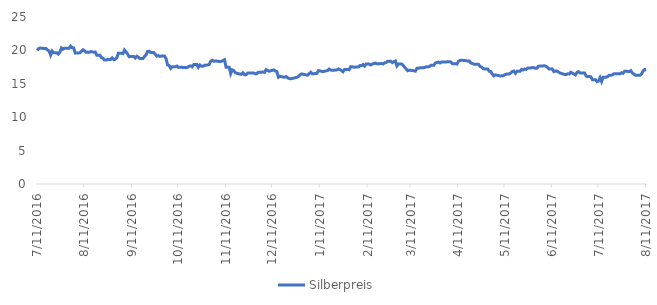
| Category | Silberpreis |
|---|---|
| 7/11/16 | 20.29 |
| 7/12/16 | 20.16 |
| 7/13/16 | 20.36 |
| 7/14/16 | 20.33 |
| 7/15/16 | 20.3 |
| 7/17/16 | 20.3 |
| 7/18/16 | 20.05 |
| 7/19/16 | 19.91 |
| 7/20/16 | 19.3 |
| 7/21/16 | 19.9 |
| 7/22/16 | 19.64 |
| 7/24/16 | 19.64 |
| 7/25/16 | 19.45 |
| 7/26/16 | 19.76 |
| 7/27/16 | 20.36 |
| 7/28/16 | 20.17 |
| 7/29/16 | 20.34 |
| 7/31/16 | 20.34 |
| 8/1/16 | 20.32 |
| 8/2/16 | 20.63 |
| 8/3/16 | 20.41 |
| 8/4/16 | 20.36 |
| 8/5/16 | 19.62 |
| 8/7/16 | 19.62 |
| 8/8/16 | 19.64 |
| 8/9/16 | 19.87 |
| 8/10/16 | 20.1 |
| 8/11/16 | 19.96 |
| 8/12/16 | 19.72 |
| 8/14/16 | 19.72 |
| 8/15/16 | 19.82 |
| 8/16/16 | 19.8 |
| 8/17/16 | 19.71 |
| 8/18/16 | 19.76 |
| 8/19/16 | 19.27 |
| 8/21/16 | 19.27 |
| 8/22/16 | 18.92 |
| 8/23/16 | 18.83 |
| 8/24/16 | 18.55 |
| 8/25/16 | 18.55 |
| 8/26/16 | 18.65 |
| 8/28/16 | 18.65 |
| 8/29/16 | 18.88 |
| 8/30/16 | 18.62 |
| 8/31/16 | 18.66 |
| 9/1/16 | 18.89 |
| 9/2/16 | 19.58 |
| 9/4/16 | 19.58 |
| 9/5/16 | 19.52 |
| 9/6/16 | 20.06 |
| 9/7/16 | 19.79 |
| 9/8/16 | 19.45 |
| 9/9/16 | 19.06 |
| 9/12/16 | 19.1 |
| 9/13/16 | 18.86 |
| 9/14/16 | 19.12 |
| 9/15/16 | 18.98 |
| 9/16/16 | 18.78 |
| 9/18/16 | 18.78 |
| 9/19/16 | 19.09 |
| 9/20/16 | 19.3 |
| 9/21/16 | 19.85 |
| 9/22/16 | 19.88 |
| 9/23/16 | 19.67 |
| 9/25/16 | 19.67 |
| 9/26/16 | 19.43 |
| 9/27/16 | 19.14 |
| 9/28/16 | 19.22 |
| 9/29/16 | 19.1 |
| 9/30/16 | 19.16 |
| 10/2/16 | 19.16 |
| 10/3/16 | 18.75 |
| 10/4/16 | 17.83 |
| 10/5/16 | 17.74 |
| 10/6/16 | 17.32 |
| 10/7/16 | 17.55 |
| 10/9/16 | 17.55 |
| 10/10/16 | 17.66 |
| 10/11/16 | 17.46 |
| 10/12/16 | 17.49 |
| 10/13/16 | 17.5 |
| 10/14/16 | 17.43 |
| 10/16/16 | 17.43 |
| 10/17/16 | 17.47 |
| 10/18/16 | 17.63 |
| 10/19/16 | 17.68 |
| 10/20/16 | 17.55 |
| 10/21/16 | 17.88 |
| 10/23/16 | 17.88 |
| 10/24/16 | 17.47 |
| 10/25/16 | 17.82 |
| 10/26/16 | 17.62 |
| 10/27/16 | 17.63 |
| 10/28/16 | 17.77 |
| 10/30/16 | 17.82 |
| 10/31/16 | 17.88 |
| 11/1/16 | 18.37 |
| 11/2/16 | 18.53 |
| 11/3/16 | 18.37 |
| 11/4/16 | 18.43 |
| 11/7/16 | 18.32 |
| 11/8/16 | 18.37 |
| 11/9/16 | 18.48 |
| 11/10/16 | 18.6 |
| 11/11/16 | 17.47 |
| 11/13/16 | 17.47 |
| 11/14/16 | 16.53 |
| 11/15/16 | 17.09 |
| 11/16/16 | 16.98 |
| 11/17/16 | 16.66 |
| 11/18/16 | 16.57 |
| 11/21/16 | 16.42 |
| 11/22/16 | 16.65 |
| 11/23/16 | 16.35 |
| 11/24/16 | 16.34 |
| 11/25/16 | 16.61 |
| 11/27/16 | 16.61 |
| 11/28/16 | 16.61 |
| 11/29/16 | 16.63 |
| 11/30/16 | 16.51 |
| 12/1/16 | 16.52 |
| 12/2/16 | 16.74 |
| 12/5/16 | 16.75 |
| 12/6/16 | 16.71 |
| 12/7/16 | 17.13 |
| 12/8/16 | 17.01 |
| 12/9/16 | 16.88 |
| 12/12/16 | 17.08 |
| 12/13/16 | 16.91 |
| 12/14/16 | 16.84 |
| 12/15/16 | 15.98 |
| 12/16/16 | 16.12 |
| 12/19/16 | 15.97 |
| 12/20/16 | 16.09 |
| 12/21/16 | 15.89 |
| 12/22/16 | 15.8 |
| 12/23/16 | 15.74 |
| 12/27/16 | 15.97 |
| 12/28/16 | 16.08 |
| 12/29/16 | 16.33 |
| 12/30/16 | 16.48 |
| 1/3/17 | 16.29 |
| 1/4/17 | 16.54 |
| 1/5/17 | 16.73 |
| 1/6/17 | 16.49 |
| 1/9/17 | 16.56 |
| 1/10/17 | 16.98 |
| 1/13/17 | 16.82 |
| 1/16/17 | 16.99 |
| 1/17/17 | 17.2 |
| 1/18/17 | 17.06 |
| 1/19/17 | 17.01 |
| 1/22/17 | 17.08 |
| 1/23/17 | 17.23 |
| 1/24/17 | 17.11 |
| 1/25/17 | 16.99 |
| 1/26/17 | 16.8 |
| 1/27/17 | 17.14 |
| 1/29/17 | 17.14 |
| 1/30/17 | 17.12 |
| 1/31/17 | 17.57 |
| 2/1/17 | 17.56 |
| 2/2/17 | 17.48 |
| 2/3/17 | 17.51 |
| 2/5/17 | 17.51 |
| 2/6/17 | 17.74 |
| 2/7/17 | 17.71 |
| 2/8/17 | 17.89 |
| 2/9/17 | 17.65 |
| 2/10/17 | 17.96 |
| 2/12/17 | 17.96 |
| 2/13/17 | 17.82 |
| 2/14/17 | 17.96 |
| 2/16/17 | 18.1 |
| 2/17/17 | 17.99 |
| 2/19/17 | 17.99 |
| 2/20/17 | 18.06 |
| 2/21/17 | 17.97 |
| 2/22/17 | 18.13 |
| 2/23/17 | 18.19 |
| 2/24/17 | 18.38 |
| 2/26/17 | 18.38 |
| 2/27/17 | 18.17 |
| 2/28/17 | 18.31 |
| 3/1/17 | 18.42 |
| 3/2/17 | 17.68 |
| 3/3/17 | 17.98 |
| 3/5/17 | 17.98 |
| 3/6/17 | 17.79 |
| 3/7/17 | 17.49 |
| 3/8/17 | 17.23 |
| 3/9/17 | 16.95 |
| 3/10/17 | 17.04 |
| 3/12/17 | 16.99 |
| 3/13/17 | 16.95 |
| 3/14/17 | 16.89 |
| 3/15/17 | 17.32 |
| 3/16/17 | 17.32 |
| 3/17/17 | 17.41 |
| 3/19/17 | 17.41 |
| 3/20/17 | 17.44 |
| 3/21/17 | 17.56 |
| 3/22/17 | 17.53 |
| 3/23/17 | 17.58 |
| 3/24/17 | 17.76 |
| 3/26/17 | 17.76 |
| 3/27/17 | 18.11 |
| 3/28/17 | 18.19 |
| 3/29/17 | 18.25 |
| 3/30/17 | 18.12 |
| 3/31/17 | 18.26 |
| 4/2/17 | 18.26 |
| 4/3/17 | 18.26 |
| 4/4/17 | 18.32 |
| 4/5/17 | 18.31 |
| 4/6/17 | 18.27 |
| 4/7/17 | 18.01 |
| 4/8/17 | 18.01 |
| 4/9/17 | 18.01 |
| 4/10/17 | 17.95 |
| 4/11/17 | 18.34 |
| 4/12/17 | 18.5 |
| 4/13/17 | 18.54 |
| 4/17/17 | 18.42 |
| 4/18/17 | 18.41 |
| 4/19/17 | 18.12 |
| 4/20/17 | 18.04 |
| 4/21/17 | 17.94 |
| 4/24/17 | 17.94 |
| 4/25/17 | 17.6 |
| 4/26/17 | 17.5 |
| 4/27/17 | 17.26 |
| 4/28/17 | 17.23 |
| 4/30/17 | 17.23 |
| 5/1/17 | 16.88 |
| 5/2/17 | 16.84 |
| 5/3/17 | 16.46 |
| 5/4/17 | 16.19 |
| 5/5/17 | 16.34 |
| 5/8/17 | 16.18 |
| 5/9/17 | 16.19 |
| 5/10/17 | 16.2 |
| 5/11/17 | 16.33 |
| 5/12/17 | 16.46 |
| 5/14/17 | 16.46 |
| 5/15/17 | 16.63 |
| 5/16/17 | 16.86 |
| 5/17/17 | 16.9 |
| 5/18/17 | 16.58 |
| 5/19/17 | 16.87 |
| 5/21/17 | 16.87 |
| 5/22/17 | 17.16 |
| 5/23/17 | 17.07 |
| 5/24/17 | 17.23 |
| 5/25/17 | 17.16 |
| 5/26/17 | 17.35 |
| 5/28/17 | 17.35 |
| 5/29/17 | 17.44 |
| 5/30/17 | 17.4 |
| 5/31/17 | 17.33 |
| 6/1/17 | 17.33 |
| 6/2/17 | 17.64 |
| 6/5/17 | 17.67 |
| 6/6/17 | 17.71 |
| 6/7/17 | 17.59 |
| 6/8/17 | 17.42 |
| 6/9/17 | 17.2 |
| 6/11/17 | 17.2 |
| 6/12/17 | 16.82 |
| 6/13/17 | 16.9 |
| 6/14/17 | 16.91 |
| 6/15/17 | 16.75 |
| 6/16/17 | 16.62 |
| 6/19/17 | 16.39 |
| 6/20/17 | 16.38 |
| 6/21/17 | 16.49 |
| 6/22/17 | 16.48 |
| 6/23/17 | 16.73 |
| 6/26/17 | 16.33 |
| 6/27/17 | 16.7 |
| 6/28/17 | 16.81 |
| 6/29/17 | 16.63 |
| 6/30/17 | 16.61 |
| 7/1/17 | 16.61 |
| 7/2/17 | 16.61 |
| 7/3/17 | 16.14 |
| 7/4/17 | 16.07 |
| 7/5/17 | 16.09 |
| 7/6/17 | 16.05 |
| 7/7/17 | 15.62 |
| 7/9/17 | 15.62 |
| 7/10/17 | 15.33 |
| 7/11/17 | 15.41 |
| 7/12/17 | 15.92 |
| 7/13/17 | 15.34 |
| 7/14/17 | 15.99 |
| 7/16/17 | 15.99 |
| 7/17/17 | 16.11 |
| 7/18/17 | 16.29 |
| 7/19/17 | 16.28 |
| 7/20/17 | 16.33 |
| 7/21/17 | 16.51 |
| 7/24/17 | 16.49 |
| 7/25/17 | 16.5 |
| 7/26/17 | 16.66 |
| 7/27/17 | 16.57 |
| 7/28/17 | 16.89 |
| 7/31/17 | 16.83 |
| 8/1/17 | 16.97 |
| 8/2/17 | 16.59 |
| 8/3/17 | 16.47 |
| 8/4/17 | 16.28 |
| 8/6/17 | 16.28 |
| 8/7/17 | 16.29 |
| 8/8/17 | 16.47 |
| 8/9/17 | 16.95 |
| 8/10/17 | 17.13 |
| 8/11/17 | 17.11 |